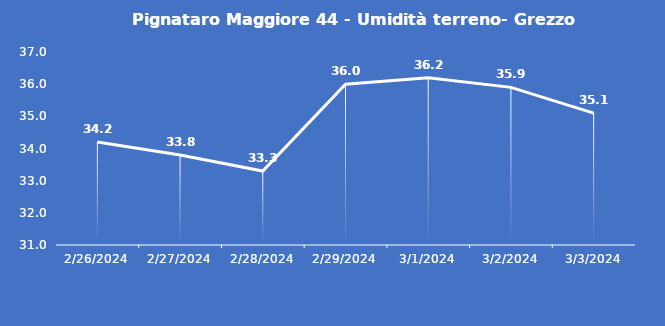
| Category | Pignataro Maggiore 44 - Umidità terreno- Grezzo (%VWC) |
|---|---|
| 2/26/24 | 34.2 |
| 2/27/24 | 33.8 |
| 2/28/24 | 33.3 |
| 2/29/24 | 36 |
| 3/1/24 | 36.2 |
| 3/2/24 | 35.9 |
| 3/3/24 | 35.1 |